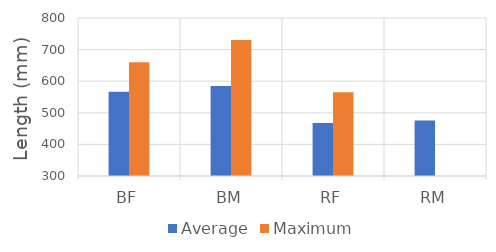
| Category | Average | Maximum |
|---|---|---|
| BF | 567 | 660 |
| BM | 585 | 730 |
| RF | 468 | 565 |
| RM | 476 | 0 |